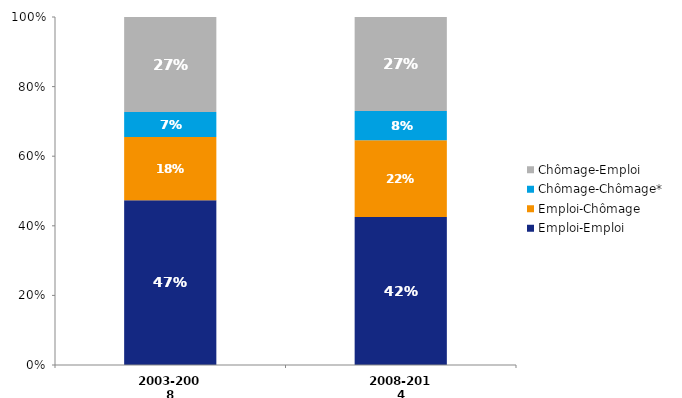
| Category | Emploi-Emploi | Emploi-Chômage | Chômage-Chômage* | Chômage-Emploi |
|---|---|---|---|---|
| 2003-2008 | 0.473 | 0.182 | 0.072 | 0.273 |
| 2008-2014 | 0.425 | 0.221 | 0.084 | 0.27 |